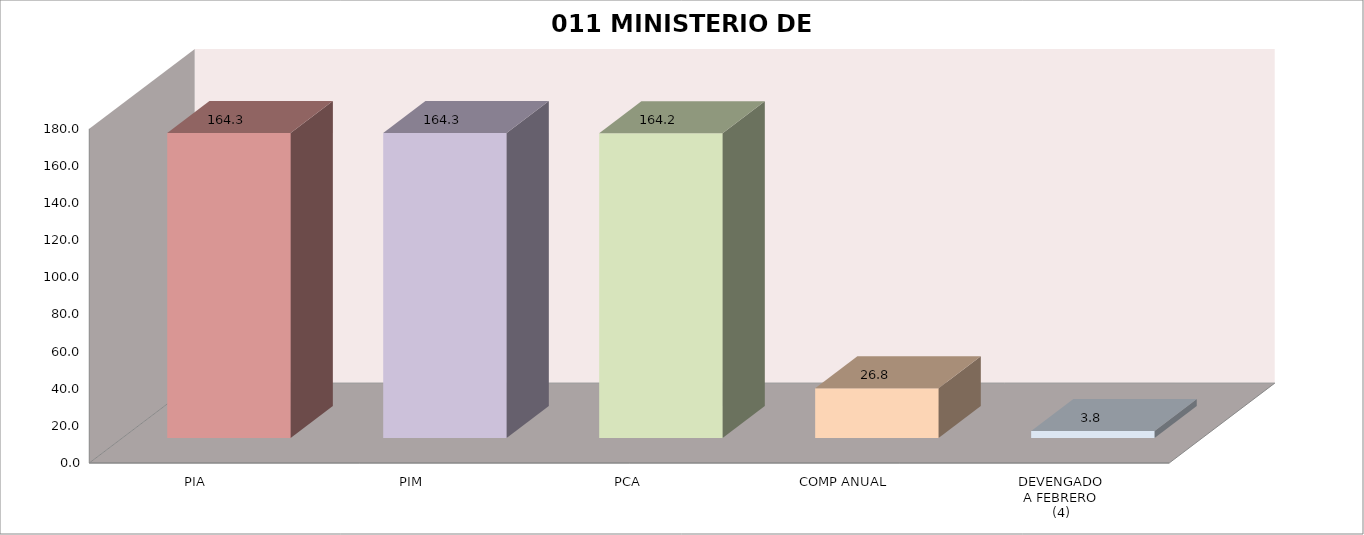
| Category | 011 MINISTERIO DE SALUD |
|---|---|
| PIA | 164.314 |
| PIM | 164.314 |
| PCA | 164.157 |
| COMP ANUAL | 26.823 |
| DEVENGADO
A FEBRERO
(4) | 3.803 |